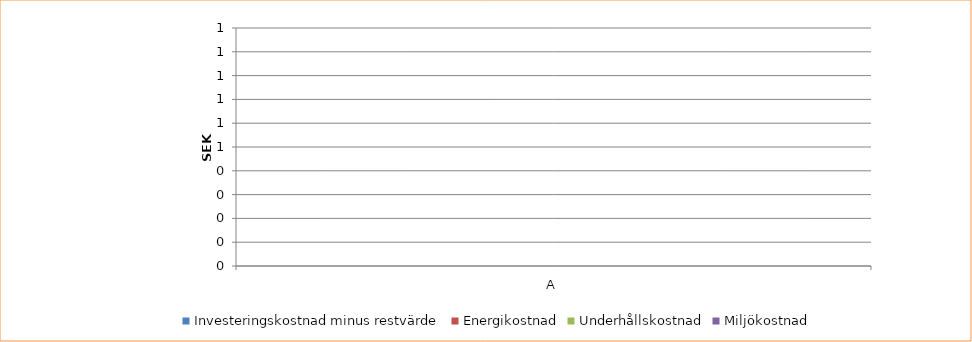
| Category | Investeringskostnad minus restvärde | Energikostnad | Underhållskostnad | Miljökostnad |
|---|---|---|---|---|
| A | 0 | 0 | 0 | 0 |
| B | 0 | 0 | 0 | 0 |
| C | 0 | 0 | 0 | 0 |